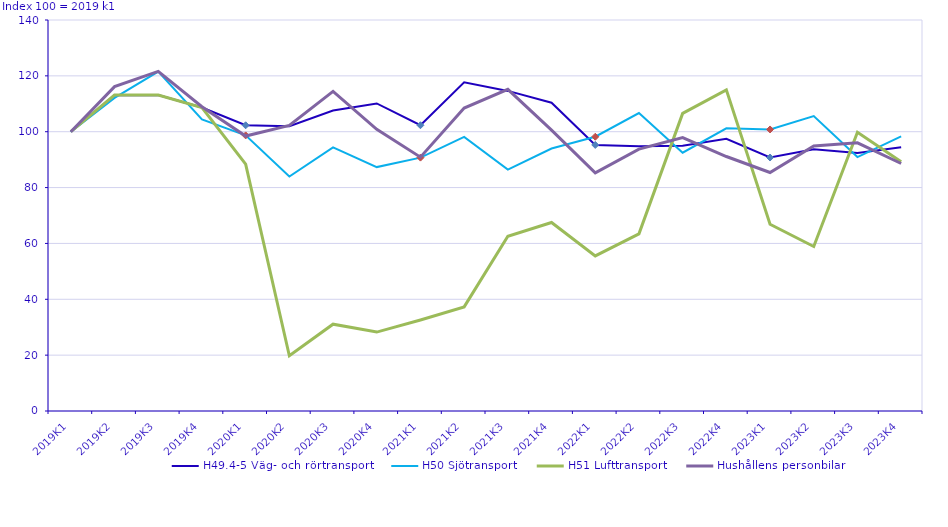
| Category | H49.4-5 Väg- och rörtransport  | H50 Sjötransport | H51 Lufttransport | Hushållens personbilar |
|---|---|---|---|---|
| 2019K1 | 100 | 100 | 100 | 100 |
| 2019K2 | 113.051 | 112.119 | 113.13 | 116.127 |
| 2019K3 | 113.118 | 121.54 | 113.155 | 121.588 |
| 2019K4 | 108.678 | 104.368 | 108.666 | 108.93 |
| 2020K1 | 102.301 | 98.685 | 88.405 | 98.443 |
| 2020K2 | 101.979 | 83.953 | 19.784 | 102.276 |
| 2020K3 | 107.574 | 94.366 | 31.088 | 114.457 |
| 2020K4 | 110.126 | 87.329 | 28.259 | 100.838 |
| 2021K1 | 102.325 | 90.724 | 32.594 | 90.888 |
| 2021K2 | 117.719 | 98.136 | 37.269 | 108.481 |
| 2021K3 | 114.614 | 86.434 | 62.582 | 115.167 |
| 2021K4 | 110.383 | 93.993 | 67.481 | 100.563 |
| 2022K1 | 95.264 | 98.196 | 55.527 | 85.281 |
| 2022K2 | 94.755 | 106.678 | 63.443 | 93.781 |
| 2022K3 | 94.939 | 92.476 | 106.566 | 97.896 |
| 2022K4 | 97.459 | 101.217 | 114.98 | 91.117 |
| 2023K1 | 90.761 | 100.809 | 66.875 | 85.39 |
| 2023K2 | 93.702 | 105.61 | 58.896 | 94.885 |
| 2023K3 | 92.369 | 90.913 | 99.82 | 96.034 |
| 2023K4 | 94.453 | 98.297 | 89.238 | 88.621 |